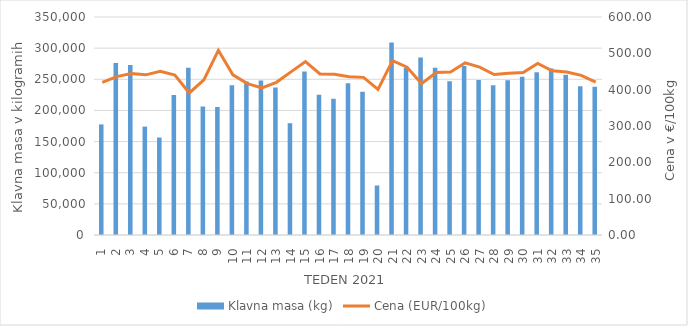
| Category | Klavna masa (kg) |
|---|---|
| 1.0 | 177573 |
| 2.0 | 275951 |
| 3.0 | 272797 |
| 4.0 | 174056 |
| 5.0 | 156508 |
| 6.0 | 224595 |
| 7.0 | 268436 |
| 8.0 | 206193 |
| 9.0 | 205669 |
| 10.0 | 240592 |
| 11.0 | 246325 |
| 12.0 | 248020 |
| 13.0 | 236703 |
| 14.0 | 179478 |
| 15.0 | 262544 |
| 16.0 | 225033 |
| 17.0 | 218950 |
| 18.0 | 243711 |
| 19.0 | 229955 |
| 20.0 | 79521 |
| 21.0 | 309134 |
| 22.0 | 268074 |
| 23.0 | 285151 |
| 24.0 | 268579 |
| 25.0 | 246944 |
| 26.0 | 271319 |
| 27.0 | 248858 |
| 28.0 | 240609 |
| 29.0 | 248383 |
| 30.0 | 253894 |
| 31.0 | 261374 |
| 32.0 | 267142 |
| 33.0 | 257352 |
| 34.0 | 239018 |
| 35.0 | 238034 |